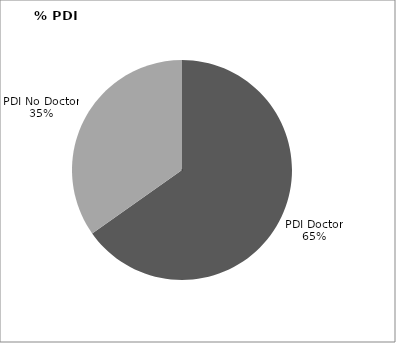
| Category | Series 0 |
|---|---|
| PDI Doctor | 1661 |
| PDI No Doctor | 886 |